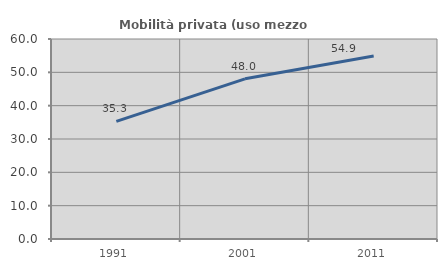
| Category | Mobilità privata (uso mezzo privato) |
|---|---|
| 1991.0 | 35.273 |
| 2001.0 | 48.05 |
| 2011.0 | 54.908 |